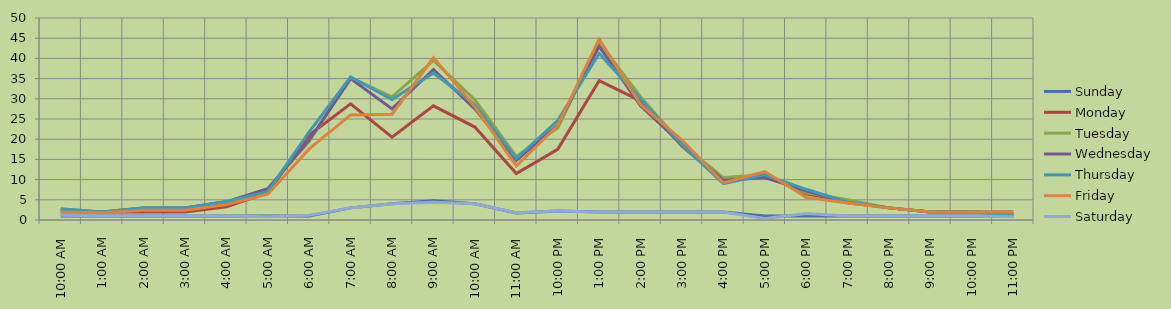
| Category | Sunday | Monday | Tuesday | Wednesday | Thursday | Friday | Saturday |
|---|---|---|---|---|---|---|---|
| 0.0 | 1 | 2.5 | 2.75 | 2 | 2.8 | 2 | 1.2 |
| 0.041666666666666664 | 1 | 2 | 2 | 2 | 2 | 1.8 | 1 |
| 0.08333333333333333 | 1 | 2 | 3 | 3 | 3 | 2.4 | 1 |
| 0.125 | 1 | 2 | 3 | 3 | 3 | 2.4 | 1 |
| 0.16666666666666666 | 1 | 3.25 | 4.5 | 4.5 | 4.6 | 3.8 | 1 |
| 0.20833333333333334 | 1 | 6.75 | 7.75 | 7.75 | 7 | 6.4 | 0.8 |
| 0.25 | 1 | 21 | 19.5 | 19.75 | 21.8 | 17.6 | 1.2 |
| 0.2916666666666667 | 3 | 28.75 | 35.25 | 35 | 35.4 | 26 | 3 |
| 0.3333333333333333 | 4 | 20.5 | 30.5 | 27.5 | 29.8 | 26.2 | 4 |
| 0.375 | 4.75 | 28.25 | 39.5 | 37.25 | 36.4 | 40.2 | 4.4 |
| 0.4166666666666667 | 4 | 23 | 29.75 | 27.5 | 28.6 | 28 | 4 |
| 0.4583333333333333 | 1.75 | 11.5 | 15.75 | 14.75 | 15.2 | 13.4 | 1.8 |
| 0.5 | 2.25 | 17.5 | 22.75 | 23.5 | 24.6 | 23.4 | 2.2 |
| 0.5416666666666666 | 2 | 34.5 | 44 | 43 | 41.2 | 44.8 | 2 |
| 0.5833333333333334 | 2 | 29.5 | 30.5 | 28.25 | 30 | 28.6 | 2 |
| 0.625 | 2 | 18.25 | 18.75 | 18.75 | 18.6 | 19.8 | 2 |
| 0.6666666666666666 | 2 | 9.75 | 10.5 | 9.75 | 9 | 9.2 | 2 |
| 0.7083333333333334 | 1 | 11.25 | 11.25 | 10.5 | 11.2 | 12 | 0.4 |
| 0.75 | 1 | 6.5 | 6.75 | 7.25 | 7.6 | 5.6 | 1.6 |
| 0.7916666666666666 | 1 | 4.5 | 5 | 4.25 | 4.4 | 4.2 | 1 |
| 0.8333333333333334 | 1 | 3 | 3 | 3 | 3 | 3 | 1 |
| 0.875 | 1 | 2 | 2 | 2 | 2 | 2 | 1 |
| 0.9166666666666666 | 1 | 2 | 2 | 2 | 2 | 2 | 1 |
| 0.9583333333333334 | 1 | 1.5 | 1.25 | 2 | 1.2 | 2 | 0.8 |